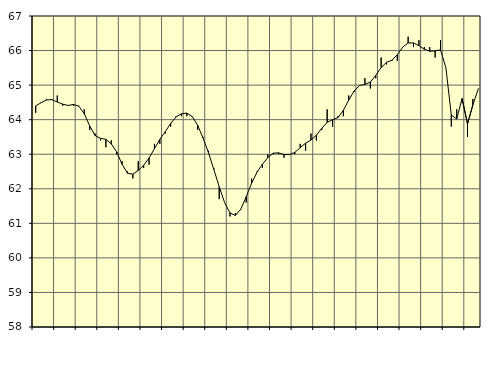
| Category | Piggar | Series 1 |
|---|---|---|
| nan | 64.2 | 64.4 |
| 1.0 | 64.5 | 64.49 |
| 1.0 | 64.6 | 64.57 |
| 1.0 | 64.6 | 64.58 |
| nan | 64.7 | 64.51 |
| 2.0 | 64.4 | 64.45 |
| 2.0 | 64.4 | 64.41 |
| 2.0 | 64.4 | 64.44 |
| nan | 64.4 | 64.39 |
| 3.0 | 64.3 | 64.17 |
| 3.0 | 63.7 | 63.82 |
| 3.0 | 63.6 | 63.54 |
| nan | 63.4 | 63.46 |
| 4.0 | 63.2 | 63.43 |
| 4.0 | 63.4 | 63.3 |
| 4.0 | 63 | 63.07 |
| nan | 62.8 | 62.71 |
| 5.0 | 62.5 | 62.45 |
| 5.0 | 62.3 | 62.42 |
| 5.0 | 62.8 | 62.53 |
| nan | 62.6 | 62.68 |
| 6.0 | 62.7 | 62.89 |
| 6.0 | 63.3 | 63.16 |
| 6.0 | 63.3 | 63.43 |
| nan | 63.6 | 63.65 |
| 7.0 | 63.8 | 63.89 |
| 7.0 | 64.1 | 64.08 |
| 7.0 | 64.1 | 64.17 |
| nan | 64.1 | 64.19 |
| 8.0 | 64.1 | 64.09 |
| 8.0 | 63.7 | 63.84 |
| 8.0 | 63.5 | 63.47 |
| nan | 63.1 | 63.05 |
| 9.0 | 62.6 | 62.56 |
| 9.0 | 61.7 | 62.06 |
| 9.0 | 61.6 | 61.6 |
| nan | 61.2 | 61.3 |
| 10.0 | 61.3 | 61.23 |
| 10.0 | 61.4 | 61.41 |
| 10.0 | 61.6 | 61.77 |
| nan | 62.3 | 62.16 |
| 11.0 | 62.5 | 62.48 |
| 11.0 | 62.6 | 62.71 |
| 11.0 | 63 | 62.9 |
| nan | 63 | 63.03 |
| 12.0 | 63 | 63.04 |
| 12.0 | 62.9 | 62.99 |
| 12.0 | 63 | 62.99 |
| nan | 63 | 63.05 |
| 13.0 | 63.3 | 63.19 |
| 13.0 | 63.1 | 63.32 |
| 13.0 | 63.6 | 63.41 |
| nan | 63.4 | 63.55 |
| 14.0 | 63.7 | 63.75 |
| 14.0 | 64.3 | 63.92 |
| 14.0 | 63.8 | 64 |
| nan | 64.1 | 64.06 |
| 15.0 | 64.1 | 64.27 |
| 15.0 | 64.7 | 64.57 |
| 15.0 | 64.8 | 64.83 |
| nan | 65 | 64.99 |
| 16.0 | 65.2 | 65.02 |
| 16.0 | 64.9 | 65.09 |
| 16.0 | 65.2 | 65.28 |
| nan | 65.8 | 65.51 |
| 17.0 | 65.6 | 65.66 |
| 17.0 | 65.7 | 65.72 |
| 17.0 | 65.7 | 65.88 |
| nan | 66.1 | 66.1 |
| 18.0 | 66.4 | 66.22 |
| 18.0 | 66.1 | 66.22 |
| 18.0 | 66.3 | 66.14 |
| nan | 66.1 | 66.04 |
| 19.0 | 66.1 | 65.98 |
| 19.0 | 65.8 | 65.99 |
| 19.0 | 66.3 | 66.02 |
| nan | 65.5 | 65.5 |
| 20.0 | 63.8 | 64.13 |
| 20.0 | 64.3 | 64.02 |
| 20.0 | 64.5 | 64.61 |
| nan | 63.5 | 63.88 |
| 21.0 | 64.6 | 64.43 |
| 21.0 | 64.9 | 64.89 |